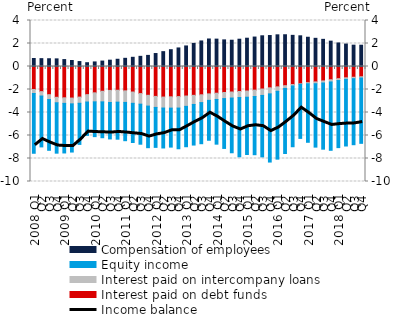
| Category | Interest paid on debt funds | Interest paid on intercompany loans | Equity income | Compensation of employees |
|---|---|---|---|---|
| 2008 Q1 | -1.997 | -0.349 | -5.198 | 0.697 |
| Q2 | -2.187 | -0.382 | -4.423 | 0.683 |
| Q3 | -2.45 | -0.422 | -4.416 | 0.675 |
| Q4 | -2.678 | -0.475 | -4.383 | 0.664 |
| 2009 Q1 | -2.722 | -0.483 | -4.313 | 0.602 |
| Q2 | -2.744 | -0.505 | -4.19 | 0.521 |
| Q3 | -2.661 | -0.538 | -3.577 | 0.429 |
| Q4 | -2.448 | -0.639 | -2.902 | 0.329 |
| 2010 Q1 | -2.29 | -0.784 | -3.026 | 0.398 |
| Q2 | -2.153 | -0.922 | -3.118 | 0.472 |
| Q3 | -2.079 | -1.052 | -3.167 | 0.549 |
| Q4 | -2.065 | -1.036 | -3.22 | 0.629 |
| 2011 Q1 | -2.117 | -1.007 | -3.329 | 0.711 |
| Q2 | -2.219 | -0.982 | -3.408 | 0.8 |
| Q3 | -2.357 | -0.919 | -3.481 | 0.884 |
| Q4 | -2.505 | -0.939 | -3.617 | 0.966 |
| 2012 Q1 | -2.601 | -0.957 | -3.474 | 1.128 |
| Q2 | -2.658 | -0.955 | -3.472 | 1.292 |
| Q3 | -2.636 | -0.983 | -3.389 | 1.461 |
| Q4 | -2.617 | -0.997 | -3.538 | 1.613 |
| 2013 Q1 | -2.567 | -0.899 | -3.511 | 1.787 |
| Q2 | -2.508 | -0.792 | -3.53 | 2.009 |
| Q3 | -2.46 | -0.679 | -3.575 | 2.222 |
| Q4 | -2.381 | -0.564 | -3.468 | 2.392 |
| 2014 Q1 | -2.323 | -0.543 | -3.887 | 2.38 |
| Q2 | -2.261 | -0.531 | -4.332 | 2.315 |
| Q3 | -2.218 | -0.526 | -4.757 | 2.284 |
| Q4 | -2.176 | -0.525 | -5.149 | 2.373 |
| 2015 Q1 | -2.131 | -0.54 | -4.98 | 2.46 |
| Q2 | -2.056 | -0.556 | -5.059 | 2.561 |
| Q3 | -1.958 | -0.558 | -5.343 | 2.67 |
| Q4 | -1.855 | -0.525 | -5.929 | 2.693 |
| 2016 Q1 | -1.77 | -0.387 | -5.9 | 2.754 |
| Q2 | -1.668 | -0.239 | -5.66 | 2.761 |
| Q3 | -1.571 | -0.12 | -5.286 | 2.709 |
| Q4 | -1.503 | -0.042 | -4.707 | 2.668 |
| 2017 Q1 | -1.408 | -0.093 | -5.089 | 2.543 |
| Q2 | -1.341 | -0.157 | -5.513 | 2.45 |
| Q3 | -1.254 | -0.18 | -5.754 | 2.361 |
| Q4 | -1.153 | -0.19 | -5.943 | 2.204 |
| 2018 Q1 | -1.059 | -0.163 | -5.833 | 2.047 |
| Q2 | -0.984 | -0.136 | -5.794 | 1.952 |
| Q3 | -0.935 | -0.123 | -5.741 | 1.856 |
| Q4 | -0.892 | -0.11 | -5.68 | 1.851 |